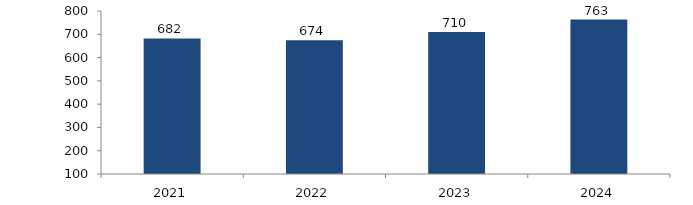
| Category | Bogotá |
|---|---|
| 2021.0 | 682.295 |
| 2022.0 | 674.32 |
| 2023.0 | 710.249 |
| 2024.0 | 763.221 |